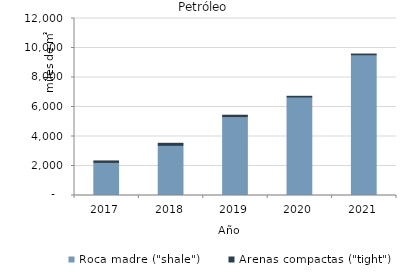
| Category | Roca madre ("shale") | Arenas compactas ("tight") |
|---|---|---|
| 2017.0 | 2173.078 | 170.951 |
| 2018.0 | 3326.572 | 213.358 |
| 2019.0 | 5268.553 | 174.218 |
| 2020.0 | 6594.123 | 131.34 |
| 2021.0 | 9454.832 | 136.368 |